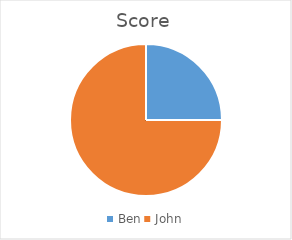
| Category | Score |
|---|---|
| Ben | 10 |
| John | 30 |